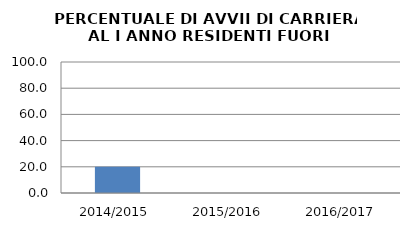
| Category | 2014/2015 2015/2016 2016/2017 |
|---|---|
| 2014/2015 | 20 |
| 2015/2016 | 0 |
| 2016/2017 | 0 |